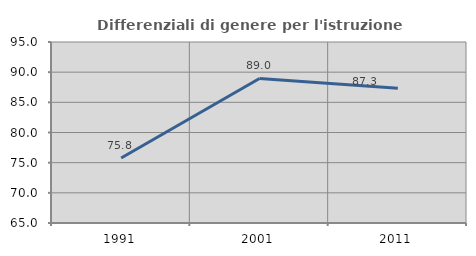
| Category | Differenziali di genere per l'istruzione superiore |
|---|---|
| 1991.0 | 75.765 |
| 2001.0 | 88.961 |
| 2011.0 | 87.34 |